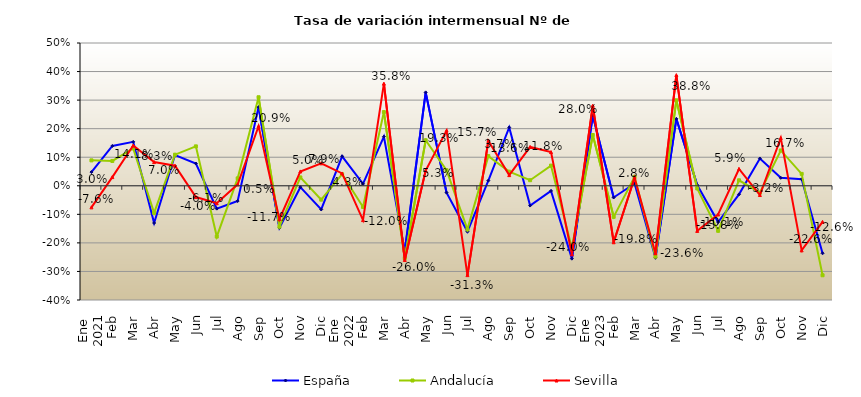
| Category | España | Andalucía | Sevilla |
|---|---|---|---|
| 0 | 0.048 | 0.089 | -0.076 |
| 1 | 0.139 | 0.087 | 0.03 |
| 2 | 0.154 | 0.131 | 0.141 |
| 3 | -0.13 | -0.095 | 0.083 |
| 4 | 0.108 | 0.109 | 0.07 |
| 5 | 0.078 | 0.138 | -0.04 |
| 6 | -0.08 | -0.178 | -0.061 |
| 7 | -0.054 | 0.026 | 0.005 |
| 8 | 0.276 | 0.31 | 0.209 |
| 9 | -0.148 | -0.143 | -0.117 |
| 10 | -0.005 | 0.029 | 0.05 |
| 11 | -0.083 | -0.049 | 0.079 |
| 12 | 0.103 | 0.041 | 0.043 |
| 13 | 0.007 | -0.074 | -0.12 |
| 14 | 0.172 | 0.258 | 0.358 |
| 15 | -0.229 | -0.254 | -0.26 |
| 16 | 0.327 | 0.159 | 0.053 |
| 17 | -0.024 | 0.054 | 0.193 |
| 18 | -0.16 | -0.153 | -0.313 |
| 19 | 0.018 | 0.104 | 0.157 |
| 20 | 0.204 | 0.049 | 0.037 |
| 21 | -0.069 | 0.02 | 0.136 |
| 22 | -0.018 | 0.071 | 0.118 |
| 23 | -0.255 | -0.218 | -0.24 |
| 24 | 0.246 | 0.178 | 0.28 |
| 25 | -0.041 | -0.109 | -0.198 |
| 26 | 0.008 | 0.031 | 0.028 |
| 27 | -0.252 | -0.248 | -0.236 |
| 28 | 0.235 | 0.299 | 0.388 |
| 29 | 0.002 | -0.01 | -0.158 |
| 30 | -0.127 | -0.158 | -0.101 |
| 31 | -0.03 | 0.019 | 0.059 |
| 32 | 0.096 | -0.024 | -0.032 |
| 33 | 0.028 | 0.124 | 0.167 |
| 34 | 0.023 | 0.042 | -0.226 |
| 35 | -0.236 | -0.313 | -0.126 |